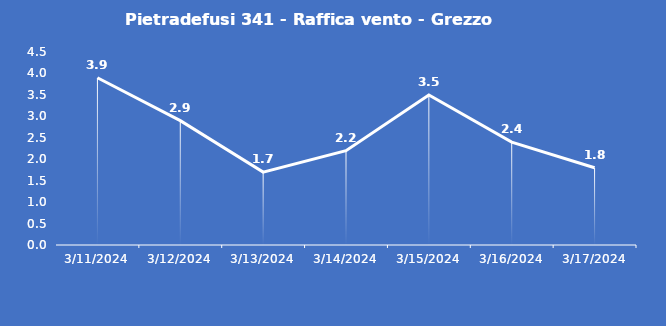
| Category | Pietradefusi 341 - Raffica vento - Grezzo (m/s) |
|---|---|
| 3/11/24 | 3.9 |
| 3/12/24 | 2.9 |
| 3/13/24 | 1.7 |
| 3/14/24 | 2.2 |
| 3/15/24 | 3.5 |
| 3/16/24 | 2.4 |
| 3/17/24 | 1.8 |